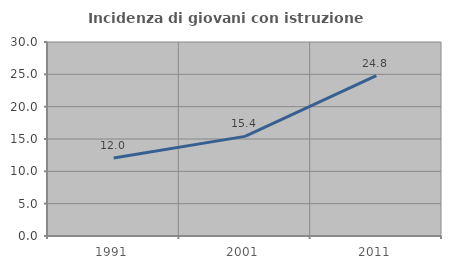
| Category | Incidenza di giovani con istruzione universitaria |
|---|---|
| 1991.0 | 12.047 |
| 2001.0 | 15.403 |
| 2011.0 | 24.789 |